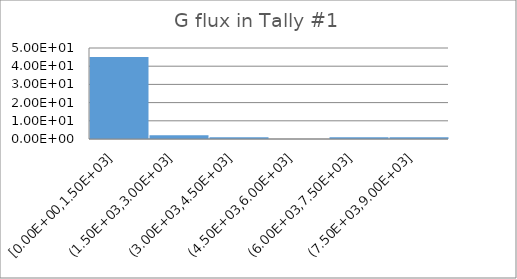
| Category | Series 0 |
|---|---|
| 1e-09 | 0 |
| 1e-08 | 0 |
| 2.5e-08 | 0 |
| 1e-07 | 0 |
| 2e-07 | 0 |
| 5e-07 | 0 |
| 1e-06 | 0 |
| 2e-06 | 0 |
| 5e-06 | 0 |
| 1e-05 | 0 |
| 2e-05 | 0 |
| 5e-05 | 0 |
| 0.0001 | 0 |
| 0.0002 | 0 |
| 0.0005 | 0 |
| 0.001 | 0 |
| 0.002 | 0 |
| 0.005 | 0 |
| 0.01 | 0 |
| 0.02 | 0 |
| 0.03 | 0 |
| 0.05 | 0 |
| 0.07 | 0 |
| 0.1 | 0 |
| 0.15 | 0 |
| 0.2 | 0 |
| 0.3 | 0 |
| 0.5 | 0 |
| 0.7 | 0 |
| 0.9 | 0 |
| 1.0 | 0 |
| 1.2 | 0 |
| 2.0 | 0 |
| 3.0 | 0 |
| 4.0 | 0 |
| 5.0 | 0 |
| 6.0 | 0 |
| 7.0 | 0 |
| 8.0 | 0 |
| 9.0 | 0 |
| 10.0 | 0 |
| 12.0 | 0 |
| 14.0 | 0 |
| 15.0 | 0 |
| 16.0 | 0 |
| 18.0 | 0 |
| 20.0 | 0 |
| 30.0 | 0 |
| 50.0 | 0 |
| 75.0 | 0 |
| 100.0 | 0 |
| 130.0 | 0 |
| 150.0 | 0 |
| 180.0 | 0 |
| 220.0 | 0 |
| 500.0 | 138.553 |
| 1000.0 | 164.932 |
| 2000.0 | 0 |
| 5000.0 | 164.932 |
| 8000.0 | 0 |